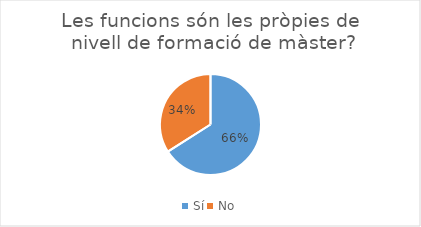
| Category | Series 0 |
|---|---|
| Sí | 33 |
| No | 17 |